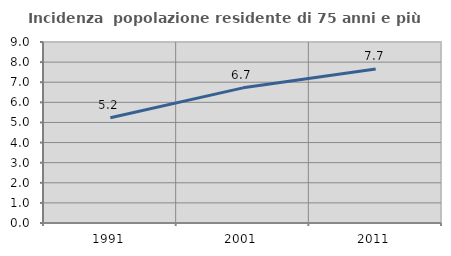
| Category | Incidenza  popolazione residente di 75 anni e più |
|---|---|
| 1991.0 | 5.234 |
| 2001.0 | 6.721 |
| 2011.0 | 7.663 |